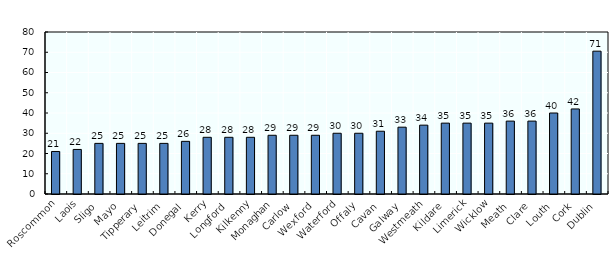
| Category | Series 0 |
|---|---|
| Roscommon | 21 |
| Laois | 22 |
| Sligo | 25 |
| Mayo | 25 |
| Tipperary | 25 |
| Leitrim | 25 |
| Donegal | 26 |
| Kerry | 28 |
| Longford | 28 |
| Kilkenny | 28 |
| Monaghan | 29 |
| Carlow | 29 |
| Wexford | 29 |
| Waterford | 30 |
| Offaly | 30 |
| Cavan | 31 |
| Galway | 33 |
| Westmeath | 34 |
| Kildare | 35 |
| Limerick | 35 |
| Wicklow | 35 |
| Meath | 36 |
| Clare | 36 |
| Louth | 40 |
| Cork | 42 |
| Dublin | 70.54 |